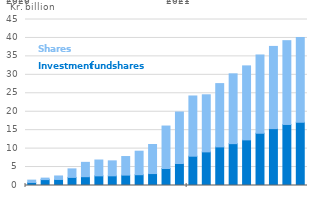
| Category | Investment fund shares | Shares |
|---|---|---|
| 2020.0 | 0.827 | 0.628 |
| nan | 1.603 | 0.398 |
| nan | 1.638 | 0.945 |
| nan | 2.194 | 2.312 |
| nan | 2.386 | 3.887 |
| nan | 2.616 | 4.292 |
| nan | 2.621 | 4.058 |
| nan | 2.815 | 5.038 |
| nan | 2.925 | 6.374 |
| nan | 3.237 | 7.88 |
| nan | 4.611 | 11.506 |
| nan | 5.958 | 13.958 |
| 2021.0 | 7.944 | 16.323 |
| nan | 9.115 | 15.477 |
| nan | 10.466 | 17.158 |
| nan | 11.346 | 18.927 |
| nan | 12.372 | 20.053 |
| nan | 14.167 | 21.218 |
| nan | 15.421 | 22.283 |
| nan | 16.548 | 22.711 |
| nan | 17.131 | 22.963 |